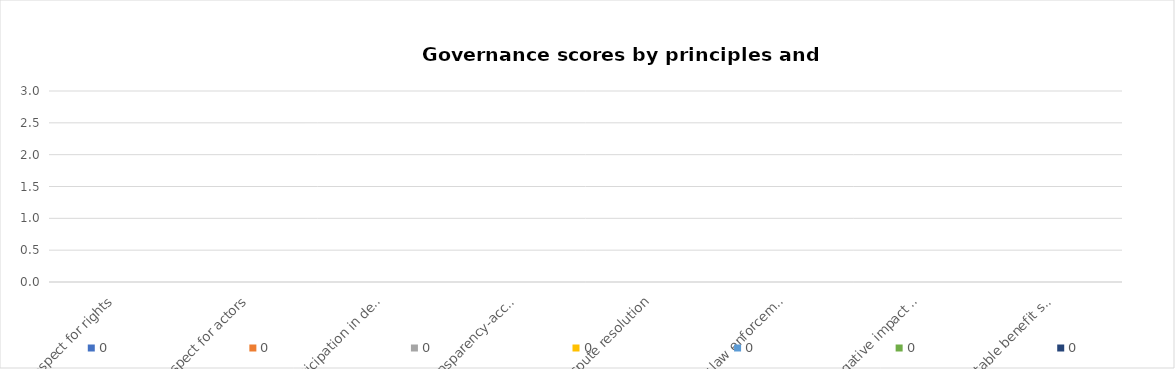
| Category | 0 |
|---|---|
| Respect for rights | 0 |
| Respect for actors | 0 |
| Participation in decisions | 0 |
| Transparency-accountability | 0 |
| Dispute resolution | 0 |
| Fair law enforcement | 0 |
| Negative impact mitigation | 0 |
| Equitable benefit sharing | 0 |